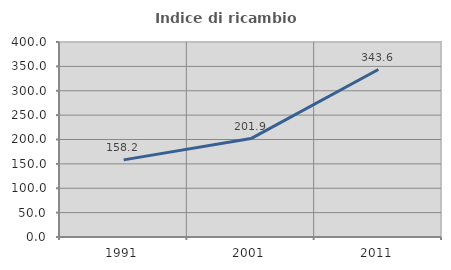
| Category | Indice di ricambio occupazionale  |
|---|---|
| 1991.0 | 158.198 |
| 2001.0 | 201.92 |
| 2011.0 | 343.56 |